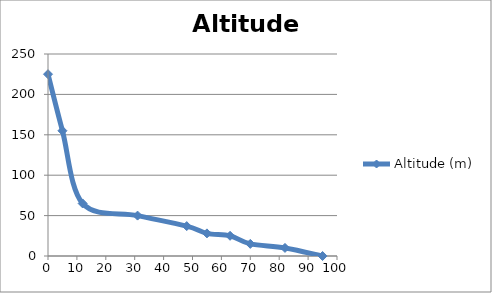
| Category | Altitude (m) |
|---|---|
| 0.0 | 225 |
| 5.0 | 155 |
| 12.0 | 65 |
| 31.0 | 50 |
| 48.0 | 37 |
| 55.0 | 28 |
| 63.0 | 25 |
| 70.0 | 15 |
| 82.0 | 10 |
| 95.0 | 0 |